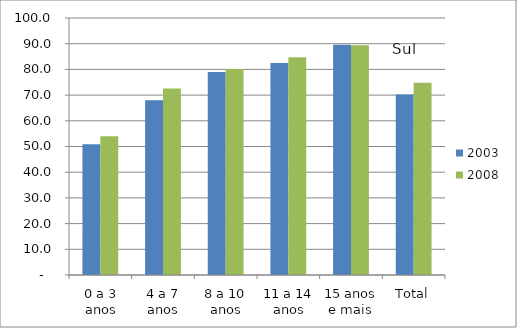
| Category | 2003 | 2008 |
|---|---|---|
| 0 a 3 anos | 50.92 | 53.95 |
| 4 a 7 anos | 67.98 | 72.61 |
| 8 a 10 anos | 79 | 80.14 |
| 11 a 14 anos | 82.45 | 84.76 |
| 15 anos e mais | 89.6 | 89.36 |
| Total | 70.19 | 74.84 |